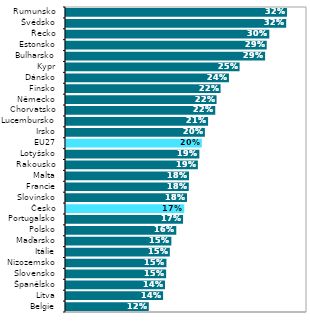
| Category | Series 0 |
|---|---|
| Belgie | 0.12 |
| Litva | 0.141 |
| Španělsko | 0.144 |
| Slovensko | 0.145 |
| Nizozemsko | 0.146 |
| Itálie | 0.151 |
| Maďarsko | 0.153 |
| Polsko | 0.16 |
| Portugalsko | 0.17 |
| Česko | 0.172 |
| Slovinsko | 0.176 |
| Francie | 0.178 |
| Malta | 0.179 |
| Rakousko | 0.192 |
| Lotyšsko | 0.194 |
| EU27 | 0.197 |
| Irsko | 0.202 |
| Lucembursko | 0.206 |
| Chorvatsko | 0.217 |
| Německo | 0.219 |
| Finsko | 0.224 |
| Dánsko | 0.237 |
| Kypr | 0.252 |
| Bulharsko | 0.289 |
| Estonsko | 0.292 |
| Řecko | 0.295 |
| Švédsko | 0.32 |
| Rumunsko | 0.321 |